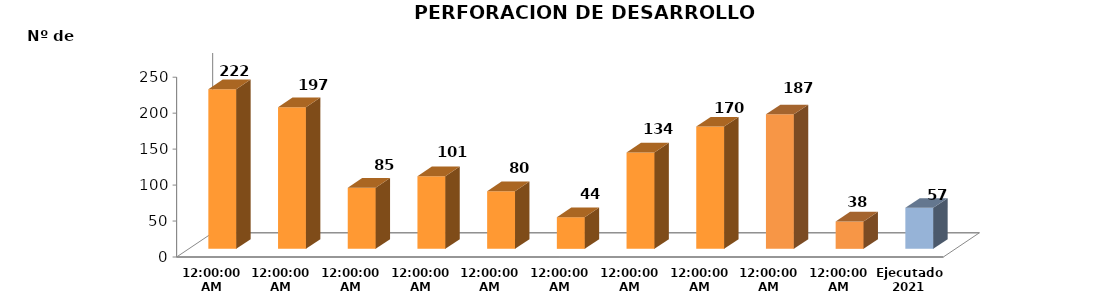
| Category | Series 0 |
|---|---|
| 2011 | 222 |
| 2012 | 197 |
| 2013 | 85 |
| 2014 | 101 |
| 2015 | 80 |
| 2016 | 44 |
| 2017 | 134 |
| 2018 | 170 |
| 2019 | 187 |
| 2020 | 38 |
| Ejecutado
2021 | 57 |